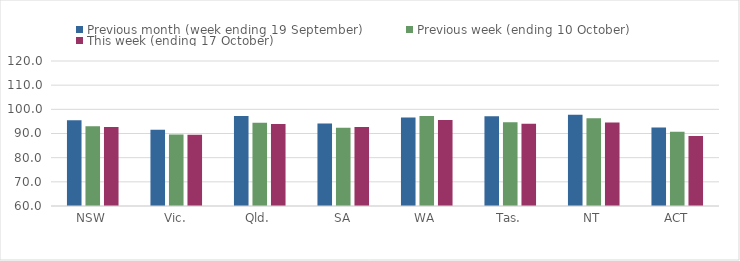
| Category | Previous month (week ending 19 September) | Previous week (ending 10 October) | This week (ending 17 October) |
|---|---|---|---|
| NSW | 95.53 | 93.04 | 92.73 |
| Vic. | 91.57 | 89.61 | 89.45 |
| Qld. | 97.23 | 94.46 | 93.97 |
| SA | 94.15 | 92.41 | 92.74 |
| WA | 96.64 | 97.24 | 95.57 |
| Tas. | 97.16 | 94.65 | 94.03 |
| NT | 97.79 | 96.36 | 94.58 |
| ACT | 92.5 | 90.7 | 89.01 |